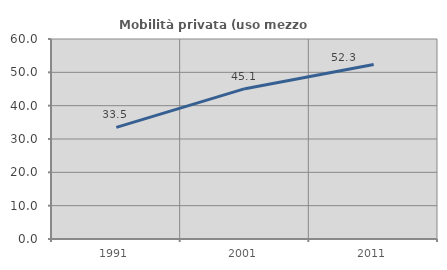
| Category | Mobilità privata (uso mezzo privato) |
|---|---|
| 1991.0 | 33.497 |
| 2001.0 | 45.096 |
| 2011.0 | 52.34 |